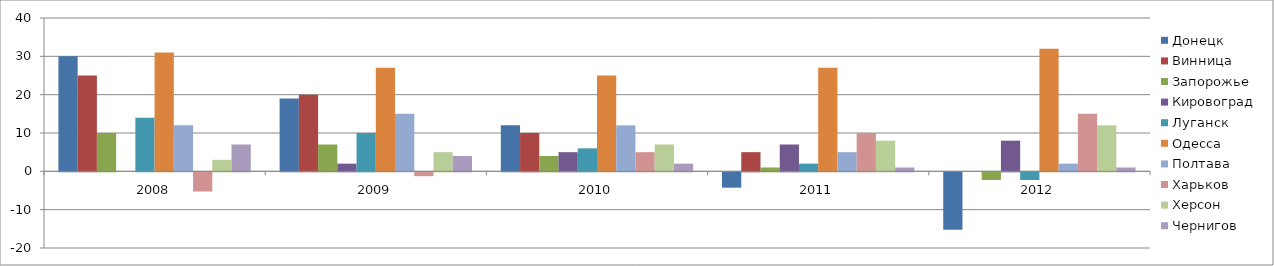
| Category | Донецк | Винница | Запорожье | Кировоград | Луганск | Одесса | Полтава | Харьков | Херсон | Чернигов |
|---|---|---|---|---|---|---|---|---|---|---|
| 2008.0 | 30 | 25 | 10 | 0 | 14 | 31 | 12 | -5 | 3 | 7 |
| 2009.0 | 19 | 20 | 7 | 2 | 10 | 27 | 15 | -1 | 5 | 4 |
| 2010.0 | 12 | 10 | 4 | 5 | 6 | 25 | 12 | 5 | 7 | 2 |
| 2011.0 | -4 | 5 | 1 | 7 | 2 | 27 | 5 | 10 | 8 | 1 |
| 2012.0 | -15 | 0 | -2 | 8 | -2 | 32 | 2 | 15 | 12 | 1 |